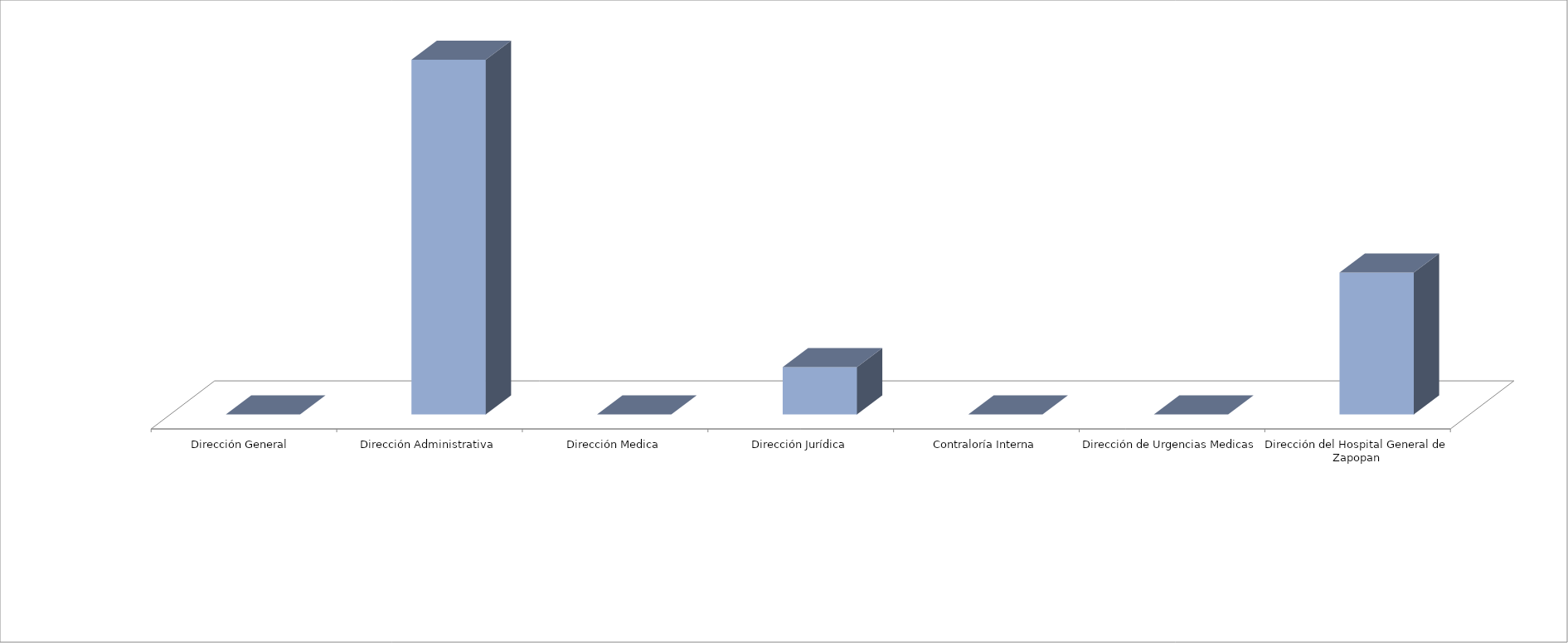
| Category | Series 0 | Series 1 |
|---|---|---|
| Dirección General  |  | 0 |
| Dirección Administrativa |  | 15 |
| Dirección Medica |  | 0 |
| Dirección Jurídica |  | 2 |
| Contraloría Interna |  | 0 |
| Dirección de Urgencias Medicas |  | 0 |
| Dirección del Hospital General de Zapopan |  | 6 |